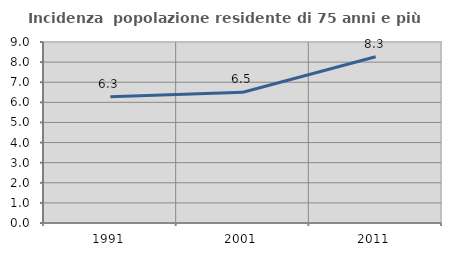
| Category | Incidenza  popolazione residente di 75 anni e più |
|---|---|
| 1991.0 | 6.279 |
| 2001.0 | 6.504 |
| 2011.0 | 8.268 |